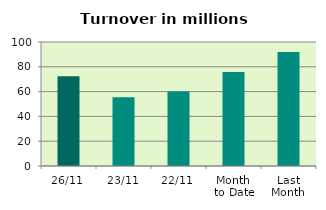
| Category | Series 0 |
|---|---|
| 26/11 | 72.353 |
| 23/11 | 55.413 |
| 22/11 | 59.984 |
| Month 
to Date | 75.724 |
| Last
Month | 91.964 |